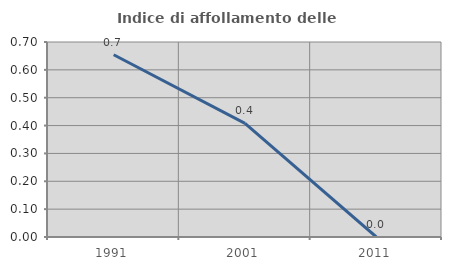
| Category | Indice di affollamento delle abitazioni  |
|---|---|
| 1991.0 | 0.654 |
| 2001.0 | 0.408 |
| 2011.0 | 0 |